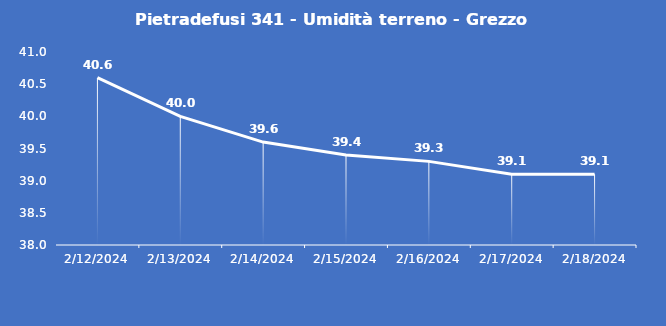
| Category | Pietradefusi 341 - Umidità terreno - Grezzo (%VWC) |
|---|---|
| 2/12/24 | 40.6 |
| 2/13/24 | 40 |
| 2/14/24 | 39.6 |
| 2/15/24 | 39.4 |
| 2/16/24 | 39.3 |
| 2/17/24 | 39.1 |
| 2/18/24 | 39.1 |